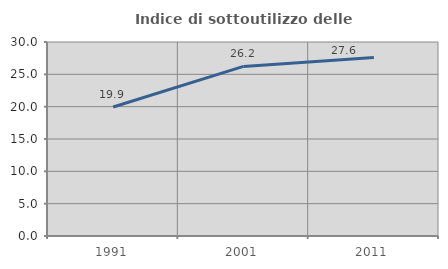
| Category | Indice di sottoutilizzo delle abitazioni  |
|---|---|
| 1991.0 | 19.946 |
| 2001.0 | 26.226 |
| 2011.0 | 27.614 |